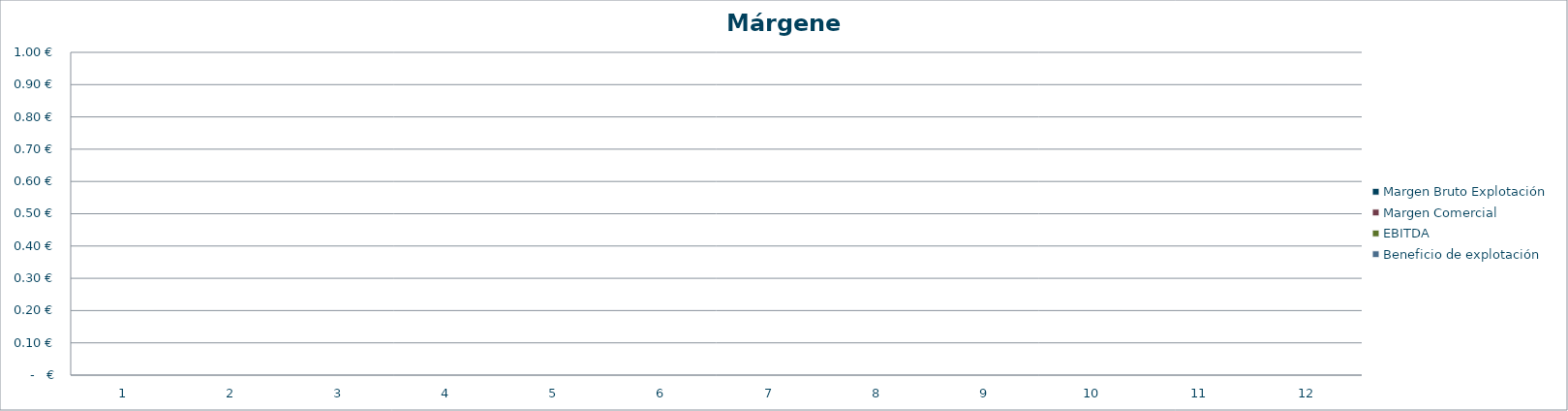
| Category | Margen Bruto Explotación | Margen Comercial | EBITDA | Beneficio de explotación |
|---|---|---|---|---|
| 1 | 0 | 0 | 0 | 0 |
| 2 | 0 | 0 | 0 | 0 |
| 3 | 0 | 0 | 0 | 0 |
| 4 | 0 | 0 | 0 | 0 |
| 5 | 0 | 0 | 0 | 0 |
| 6 | 0 | 0 | 0 | 0 |
| 7 | 0 | 0 | 0 | 0 |
| 8 | 0 | 0 | 0 | 0 |
| 9 | 0 | 0 | 0 | 0 |
| 10 | 0 | 0 | 0 | 0 |
| 11 | 0 | 0 | 0 | 0 |
| 12 | 0 | 0 | 0 | 0 |